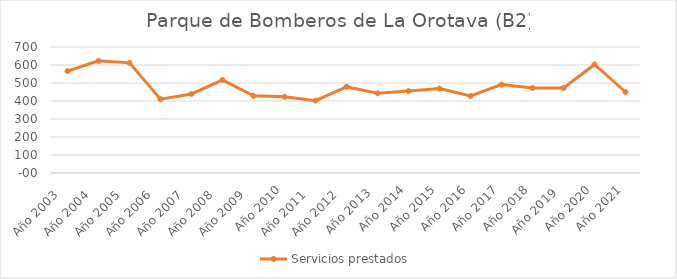
| Category | Servicios prestados  |
|---|---|
| Año 2003   | 566 |
| Año 2004   | 623 |
| Año 2005   | 612 |
| Año 2006   | 410 |
| Año 2007   | 439 |
| Año 2008   | 517 |
| Año 2009   | 429 |
| Año 2010 | 423 |
| Año 2011   | 402 |
| Año 2012   | 479 |
| Año 2013  | 443 |
| Año 2014 | 455 |
| Año 2015 | 469 |
| Año 2016 | 428 |
| Año 2017 | 491 |
| Año 2018 | 472 |
| Año 2019  | 472 |
| Año 2020 | 603 |
| Año 2021 | 450 |